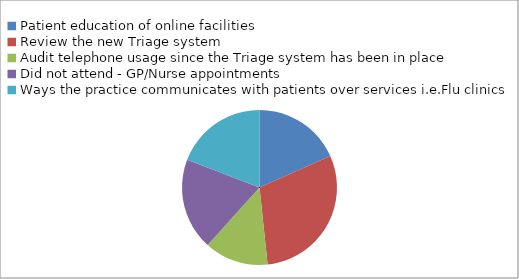
| Category | Series 0 |
|---|---|
| Patient education of online facilities | 22 |
| Review the new Triage system | 36 |
| Audit telephone usage since the Triage system has been in place | 16 |
| Did not attend - GP/Nurse appointments | 23 |
| Ways the practice communicates with patients over services i.e.Flu clinics | 23 |